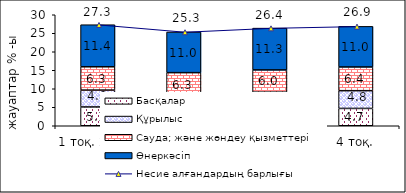
| Category | Басқалар | Құрылыс | Сауда; және жөндеу қызметтері | Өнеркәсіп |
|---|---|---|---|---|
| 1 тоқ. 2008  | 5.08 | 4.56 | 6.3 | 11.37 |
| 2 тоқ. | 3.98 | 4.1 | 6.27 | 10.99 |
| 3 тоқ. | 4.38 | 4.69 | 6.02 | 11.3 |
| 4 тоқ. | 4.68 | 4.8 | 6.41 | 10.97 |